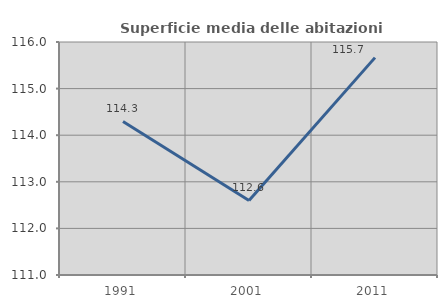
| Category | Superficie media delle abitazioni occupate |
|---|---|
| 1991.0 | 114.294 |
| 2001.0 | 112.6 |
| 2011.0 | 115.665 |